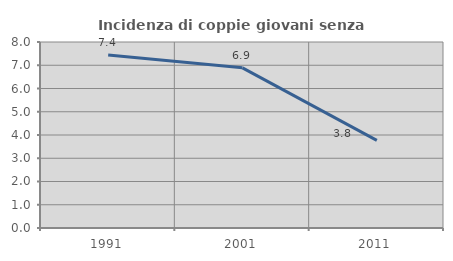
| Category | Incidenza di coppie giovani senza figli |
|---|---|
| 1991.0 | 7.44 |
| 2001.0 | 6.89 |
| 2011.0 | 3.768 |